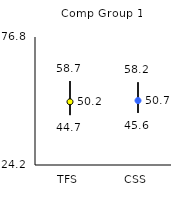
| Category | 25th | 75th | Mean |
|---|---|---|---|
| TFS | 44.7 | 58.7 | 50.17 |
| CSS | 45.6 | 58.2 | 50.68 |